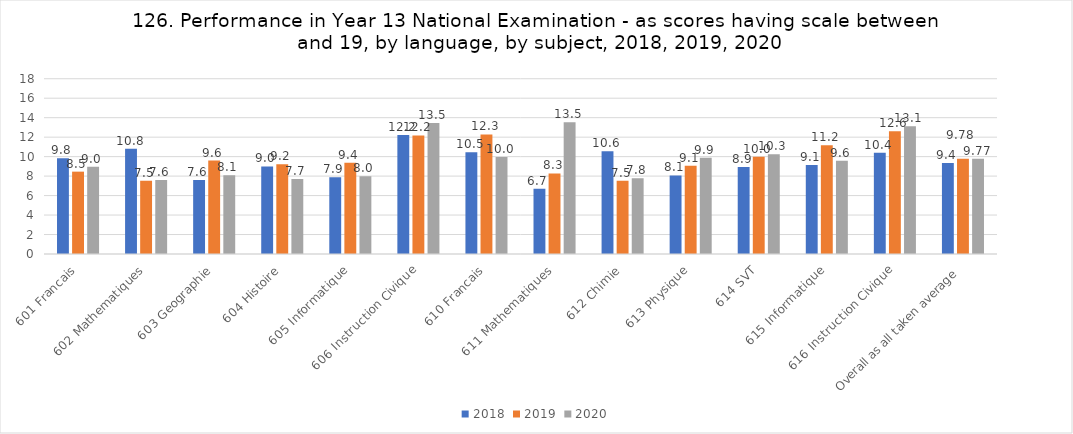
| Category | 2018 | 2019 | 2020 |
|---|---|---|---|
| 601 Francais | 9.837 | 8.458 | 8.972 |
| 602 Mathematiques | 10.801 | 7.525 | 7.61 |
| 603 Geographie | 7.59 | 9.592 | 8.089 |
| 604 Histoire | 8.988 | 9.207 | 7.714 |
| 605 Informatique | 7.873 | 9.369 | 7.995 |
| 606 Instruction Civique | 12.229 | 12.173 | 13.455 |
| 610 Francais | 10.459 | 12.282 | 9.955 |
| 611 Mathematiques | 6.698 | 8.276 | 13.536 |
| 612 Chimie | 10.56 | 7.524 | 7.788 |
| 613 Physique | 8.063 | 9.053 | 9.894 |
| 614 SVT | 8.925 | 9.982 | 10.251 |
| 615 Informatique | 9.138 | 11.171 | 9.564 |
| 616 Instruction Civique | 10.39 | 12.606 | 13.128 |
| Overall as all taken average | 9.354 | 9.777 | 9.772 |